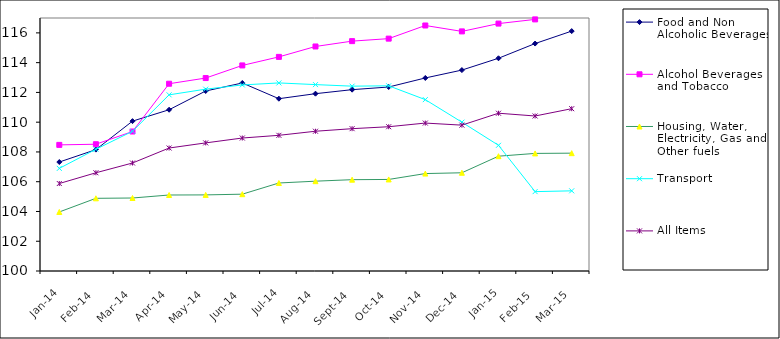
| Category | Food and Non Alcoholic Beverages | Alcohol Beverages and Tobacco | Housing, Water, Electricity, Gas and Other fuels | Transport | All Items  |
|---|---|---|---|---|---|
| 2014-01-01 | 107.321 | 108.474 | 103.967 | 106.895 | 105.878 |
| 2014-02-01 | 108.156 | 108.519 | 104.883 | 108.18 | 106.601 |
| 2014-03-01 | 110.07 | 109.373 | 104.905 | 109.388 | 107.257 |
| 2014-04-01 | 110.836 | 112.583 | 105.106 | 111.837 | 108.264 |
| 2014-05-01 | 112.095 | 112.965 | 105.114 | 112.218 | 108.608 |
| 2014-06-01 | 112.634 | 113.813 | 105.162 | 112.502 | 108.936 |
| 2014-07-01 | 111.577 | 114.387 | 105.914 | 112.638 | 109.117 |
| 2014-08-01 | 111.915 | 115.087 | 106.036 | 112.525 | 109.391 |
| 2014-09-01 | 112.185 | 115.445 | 106.136 | 112.42 | 109.563 |
| 2014-10-01 | 112.363 | 115.614 | 106.151 | 112.444 | 109.694 |
| 2014-11-01 | 112.971 | 116.497 | 106.547 | 111.515 | 109.94 |
| 2014-12-01 | 113.5 | 116.1 | 106.6 | 110 | 109.8 |
| 2015-01-01 | 114.295 | 116.625 | 107.716 | 108.446 | 110.601 |
| 2015-02-01 | 115.283 | 116.906 | 107.901 | 105.333 | 110.415 |
| 2015-03-01 | 116.12 | 118.76 | 107.917 | 105.386 | 110.906 |